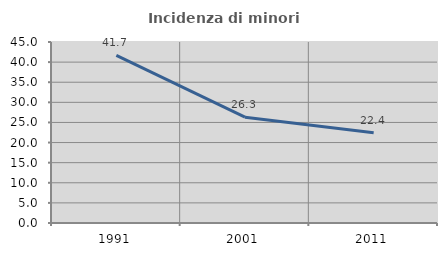
| Category | Incidenza di minori stranieri |
|---|---|
| 1991.0 | 41.667 |
| 2001.0 | 26.316 |
| 2011.0 | 22.414 |